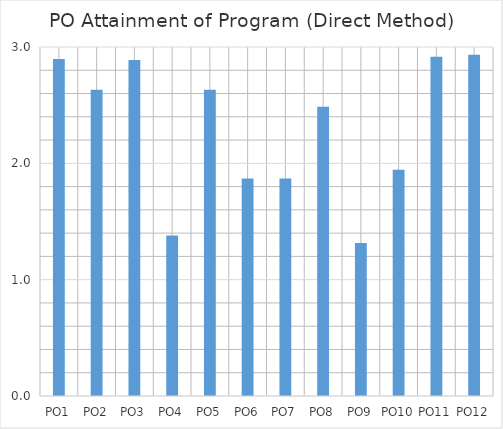
| Category | Series 0 |
|---|---|
| PO1 | 2.896 |
| PO2 | 2.631 |
| PO3 | 2.889 |
| PO4 | 1.381 |
| PO5 | 2.633 |
| PO6 | 1.87 |
| PO7 | 1.87 |
| PO8 | 2.487 |
| PO9 | 1.315 |
| PO10 | 1.944 |
| PO11 | 2.917 |
| PO12 | 2.933 |